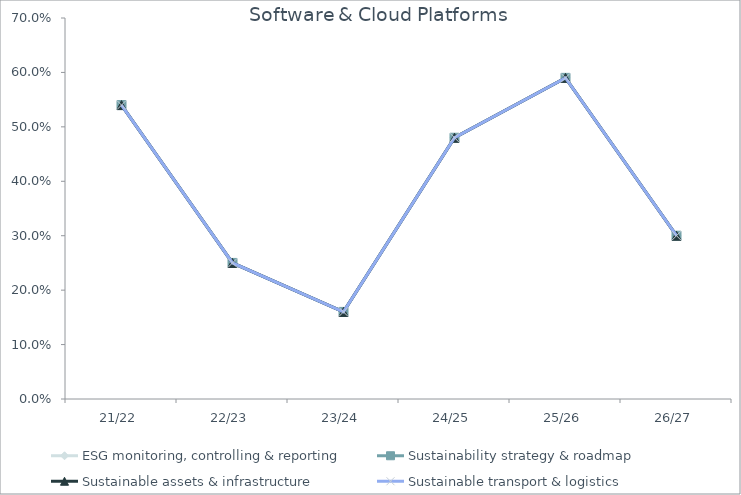
| Category | ESG monitoring, controlling & reporting | Sustainability strategy & roadmap | Sustainable assets & infrastructure | Sustainable transport & logistics |
|---|---|---|---|---|
| 21/22 | 0.54 | 0.54 | 0.54 | 0.54 |
| 22/23 | 0.25 | 0.25 | 0.25 | 0.25 |
| 23/24 | 0.16 | 0.16 | 0.16 | 0.16 |
| 24/25 | 0.48 | 0.48 | 0.48 | 0.48 |
| 25/26 | 0.59 | 0.59 | 0.59 | 0.59 |
| 26/27 | 0.3 | 0.3 | 0.3 | 0.3 |